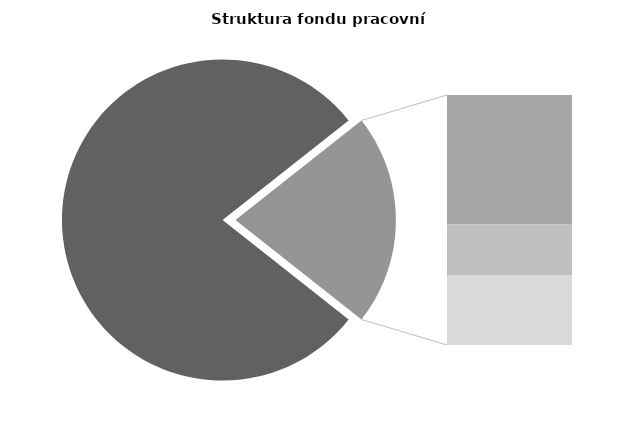
| Category | Series 0 |
|---|---|
| Průměrná měsíční 
odpracovaná doba  
bez přesčasu | 135.637 |
| Dovolená | 18.973 |
| Nemoc | 7.421 |
| Jiné | 10.252 |